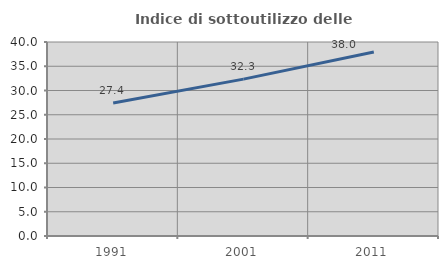
| Category | Indice di sottoutilizzo delle abitazioni  |
|---|---|
| 1991.0 | 27.408 |
| 2001.0 | 32.347 |
| 2011.0 | 37.955 |